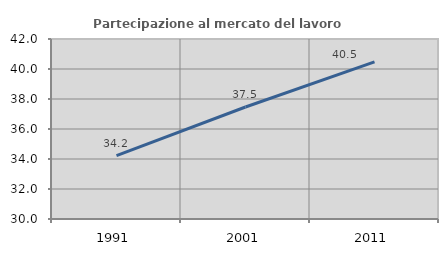
| Category | Partecipazione al mercato del lavoro  femminile |
|---|---|
| 1991.0 | 34.223 |
| 2001.0 | 37.468 |
| 2011.0 | 40.473 |